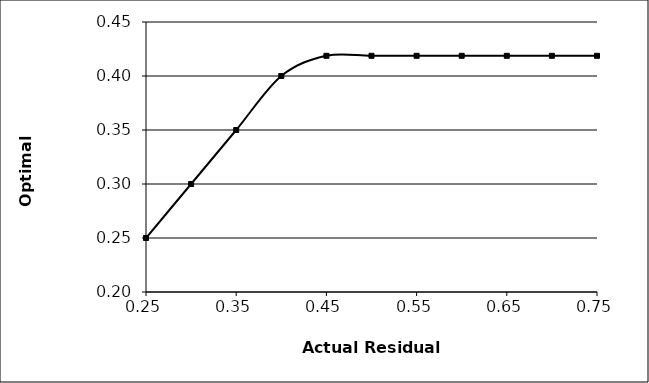
| Category | Series 1 |
|---|---|
| 0.25 | 0.25 |
| 0.3 | 0.3 |
| 0.35 | 0.35 |
| 0.4 | 0.4 |
| 0.45 | 0.419 |
| 0.5 | 0.419 |
| 0.55 | 0.419 |
| 0.6 | 0.419 |
| 0.65 | 0.419 |
| 0.7 | 0.419 |
| 0.75 | 0.419 |